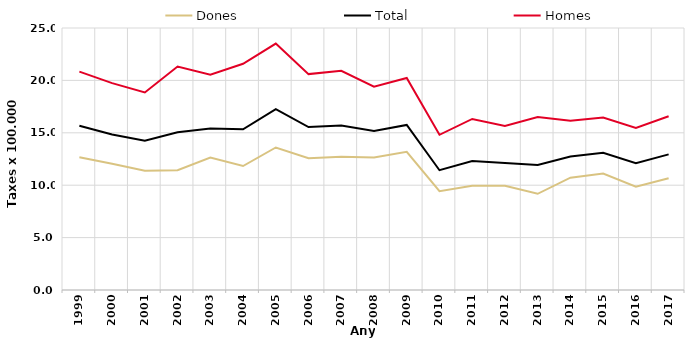
| Category | Dones | Total | Homes |
|---|---|---|---|
| 1999.0 | 12.66 | 15.68 | 20.84 |
| 2000.0 | 12.04 | 14.83 | 19.74 |
| 2001.0 | 11.38 | 14.25 | 18.85 |
| 2002.0 | 11.43 | 15.05 | 21.32 |
| 2003.0 | 12.64 | 15.42 | 20.55 |
| 2004.0 | 11.83 | 15.33 | 21.59 |
| 2005.0 | 13.6 | 17.26 | 23.51 |
| 2006.0 | 12.58 | 15.55 | 20.6 |
| 2007.0 | 12.71 | 15.69 | 20.92 |
| 2008.0 | 12.65 | 15.18 | 19.4 |
| 2009.0 | 13.18 | 15.75 | 20.23 |
| 2010.0 | 9.43 | 11.43 | 14.81 |
| 2011.0 | 9.94 | 12.31 | 16.32 |
| 2012.0 | 9.95 | 12.12 | 15.65 |
| 2013.0 | 9.18 | 11.93 | 16.51 |
| 2014.0 | 10.72 | 12.73 | 16.14 |
| 2015.0 | 11.12 | 13.09 | 16.45 |
| 2016.0 | 9.86 | 12.09 | 15.46 |
| 2017.0 | 10.67 | 12.94 | 16.58 |